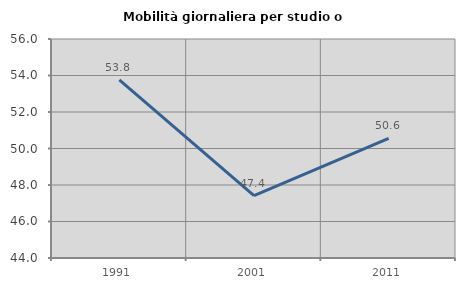
| Category | Mobilità giornaliera per studio o lavoro |
|---|---|
| 1991.0 | 53.766 |
| 2001.0 | 47.423 |
| 2011.0 | 50.559 |